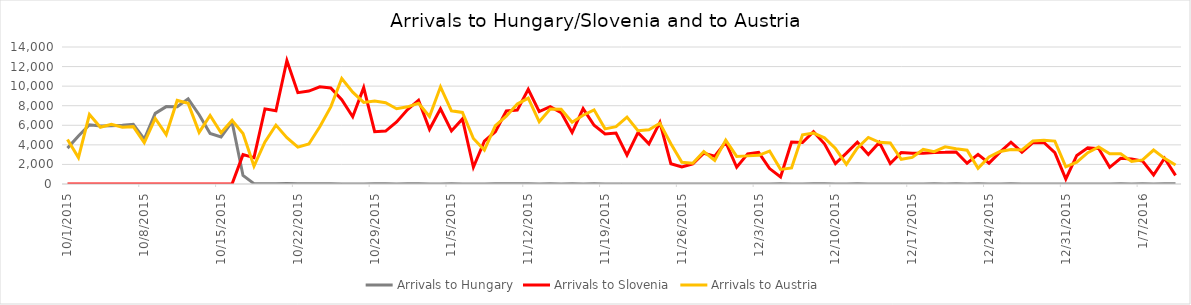
| Category | Arrivals to Hungary | Arrivals to Slovenia | Arrivals to Austria |
|---|---|---|---|
| 10/1/15 | 3667 | 0 | 4550 |
| 10/2/15 | 4897 | 0 | 2700 |
| 10/3/15 | 6056 | 0 | 7100 |
| 10/4/15 | 5925 | 0 | 5800 |
| 10/5/15 | 5952 | 0 | 6100 |
| 10/6/15 | 6000 | 0 | 5800 |
| 10/7/15 | 6103 | 0 | 5861 |
| 10/8/15 | 4583 | 6 | 4229 |
| 10/9/15 | 7215 | 0 | 6700 |
| 10/10/15 | 7907 | 0 | 5050 |
| 10/11/15 | 7897 | 0 | 8540 |
| 10/12/15 | 8702 | 0 | 8240 |
| 10/13/15 | 7081 | 0 | 5280 |
| 10/14/15 | 5157 | 0 | 7000 |
| 10/15/15 | 4808 | 0 | 5235 |
| 10/16/15 | 6353 | 0 | 6500 |
| 10/17/15 | 870 | 3000 | 5155 |
| 10/18/15 | 41 | 2700 | 1822 |
| 10/19/15 | 22 | 7677 | 4300 |
| 10/20/15 | 36 | 7478 | 6017 |
| 10/21/15 | 39 | 12616 | 4737 |
| 10/22/15 | 32 | 9339 | 3767 |
| 10/23/15 | 29 | 9500 | 4092 |
| 10/24/15 | 35 | 9925 | 5841 |
| 10/25/15 | 34 | 9818 | 7882 |
| 10/26/15 | 12 | 8625 | 10784 |
| 10/27/15 | 7 | 6877 | 9390 |
| 10/28/15 | 4 | 9848 | 8336 |
| 10/29/15 | 23 | 5341 | 8473 |
| 10/30/15 | 18 | 5409 | 8302 |
| 10/31/15 | 10 | 6344 | 7691 |
| 11/1/15 | 14 | 7611 | 7887 |
| 11/2/15 | 31 | 8568 | 8243 |
| 11/3/15 | 8 | 5591 | 6900 |
| 11/4/15 | 10 | 7693 | 9930 |
| 11/5/15 | 18 | 5426 | 7478 |
| 11/6/15 | 4 | 6655 | 7315 |
| 11/7/15 | 8 | 1716 | 4648 |
| 11/8/15 | 9 | 4381 | 3465 |
| 11/9/15 | 25 | 5341 | 5962 |
| 11/10/15 | 14 | 7457 | 6933 |
| 11/11/15 | 13 | 7554 | 8169 |
| 11/12/15 | 23 | 9681 | 8777 |
| 11/13/15 | 6 | 7397 | 6351 |
| 11/14/15 | 21 | 7905 | 7659 |
| 11/15/15 | 8 | 7300 | 7632 |
| 11/16/15 | 15 | 5261 | 6319 |
| 11/17/15 | 5 | 7704 | 7026 |
| 11/18/15 | 15 | 5998 | 7577 |
| 11/19/15 | 4 | 5119 | 5635 |
| 11/20/15 | 9 | 5211 | 5865 |
| 11/21/15 | 2 | 2952 | 6836 |
| 11/22/15 | 11 | 5260 | 5446 |
| 11/23/15 | 4 | 4102 | 5546 |
| 11/24/15 | 4 | 6297 | 6204 |
| 11/25/15 | 6 | 2070 | 4122 |
| 11/26/15 | 10 | 1742 | 2211 |
| 11/27/15 | 2 | 2065 | 2120 |
| 11/28/15 | 6 | 3139 | 3320 |
| 11/29/15 | 3 | 2843 | 2407 |
| 11/30/15 | 7 | 4274 | 4482 |
| 12/1/15 | 4 | 1709 | 2821 |
| 12/2/15 | 4 | 3077 | 2874 |
| 12/3/15 | 9 | 3237 | 2935 |
| 12/4/15 | 1 | 1577 | 3366 |
| 12/5/15 | 31 | 715 | 1493 |
| 12/6/15 | 7 | 4288 | 1643 |
| 12/7/15 | 0 | 4240 | 5035 |
| 12/8/15 | 13 | 5351 | 5210 |
| 12/9/15 | 14 | 4103 | 4714 |
| 12/10/15 | 3 | 2078 | 3623 |
| 12/11/15 | 0 | 3149 | 2000 |
| 12/12/15 | 13 | 4271 | 3675 |
| 12/13/15 | 10 | 3016 | 4754 |
| 12/14/15 | 3 | 4250 | 4263 |
| 12/15/15 | 2 | 2098 | 4193 |
| 12/16/15 | 6 | 3214 | 2519 |
| 12/17/15 | 0 | 3135 | 2717 |
| 12/18/15 | 11 | 3150 | 3532 |
| 12/19/15 | 31 | 3222 | 3305 |
| 12/20/15 | 8 | 3233 | 3800 |
| 12/21/15 | 25 | 3278 | 3611 |
| 12/22/15 | 1 | 2118 | 3451 |
| 12/23/15 | 21 | 3030 | 1613 |
| 12/24/15 | 8 | 2131 | 2764 |
| 12/25/15 | 2 | 3257 | 3321 |
| 12/26/15 | 17 | 4274 | 3532 |
| 12/27/15 | 10 | 3253 | 3476 |
| 12/28/15 | 0 | 4228 | 4394 |
| 12/29/15 | 0 | 4239 | 4468 |
| 12/30/15 | 11 | 3195 | 4386 |
| 12/31/15 | 5 | 511 | 1756 |
| 1/1/16 | 0 | 2914 | 2226 |
| 1/2/16 | 0 | 3690 | 3199 |
| 1/3/16 | 0 | 3619 | 3793 |
| 1/4/16 | 0 | 1708 | 3085 |
| 1/5/16 | 18 | 2626 | 3091 |
| 1/6/16 | 5 | 2550 | 2299 |
| 1/7/16 | 31 | 2337 | 2466 |
| 1/8/16 | 0 | 916 | 3472 |
| 1/9/16 | 15 | 2630 | 2619 |
| 1/10/16 | 28 | 880 | 1934 |